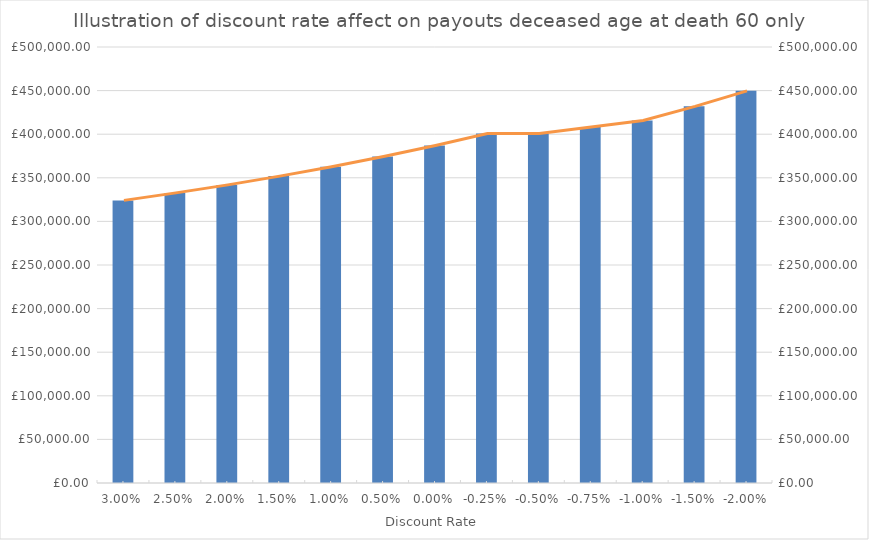
| Category | DECEASED’S AGE ON DEATH |
|---|---|
| 0.03 | 324096.6 |
| 0.025 | 332695.65 |
| 0.02 | 341876.7 |
| 0.015 | 351930.75 |
| 0.01 | 362663.8 |
| 0.005 | 374381.4 |
| 0.0 | 387069 |
| -0.0025 | 400823.6 |
| -0.005 | 400823.6 |
| -0.0075 | 408297.45 |
| -0.01 | 415756.75 |
| -0.015 | 431950.9 |
| -0.02 | 449711.6 |